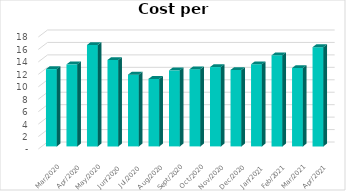
| Category | Cost / Conv |
|---|---|
| 2021-04-30 | 15.948 |
| 2021-03-31 | 12.596 |
| 2021-02-28 | 14.633 |
| 2021-01-31 | 13.197 |
| 2020-12-31 | 12.288 |
| 2020-11-30 | 12.747 |
| 2020-10-31 | 12.407 |
| 2020-09-30 | 12.217 |
| 2020-08-31 | 10.847 |
| 2020-07-31 | 11.531 |
| 2020-06-30 | 13.886 |
| 2020-05-31 | 16.303 |
| 2020-04-30 | 13.181 |
| 2020-03-31 | 12.42 |